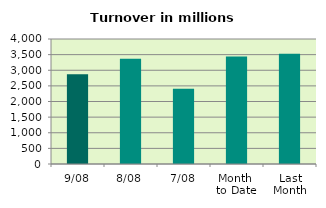
| Category | Series 0 |
|---|---|
| 9/08 | 2873.73 |
| 8/08 | 3370.621 |
| 7/08 | 2404.475 |
| Month 
to Date | 3442.965 |
| Last
Month | 3531.02 |